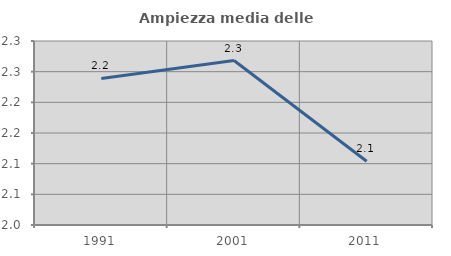
| Category | Ampiezza media delle famiglie |
|---|---|
| 1991.0 | 2.239 |
| 2001.0 | 2.268 |
| 2011.0 | 2.104 |